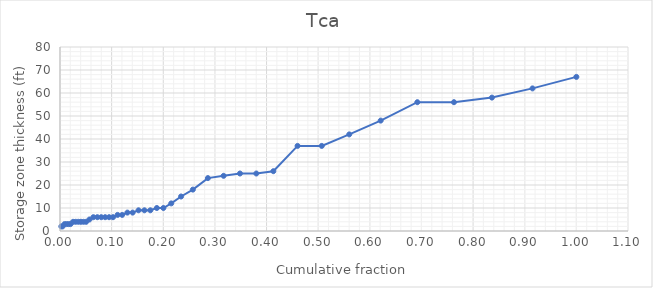
| Category | Series 0 |
|---|---|
| 0.0025348542458808617 | 2 |
| 0.005069708491761723 | 2 |
| 0.008871989860583017 | 3 |
| 0.012674271229404309 | 3 |
| 0.016476552598225603 | 3 |
| 0.020278833967046897 | 3 |
| 0.02534854245880862 | 4 |
| 0.030418250950570346 | 4 |
| 0.035487959442332066 | 4 |
| 0.04055766793409379 | 4 |
| 0.04562737642585551 | 4 |
| 0.05069708491761723 | 4 |
| 0.05703422053231938 | 5 |
| 0.06463878326996196 | 6 |
| 0.07224334600760454 | 6 |
| 0.07984790874524712 | 6 |
| 0.0874524714828897 | 6 |
| 0.09505703422053229 | 6 |
| 0.10266159695817487 | 6 |
| 0.11153358681875788 | 7 |
| 0.1204055766793409 | 7 |
| 0.13054499366286434 | 8 |
| 0.1406844106463878 | 8 |
| 0.15209125475285168 | 9 |
| 0.16349809885931554 | 9 |
| 0.1749049429657794 | 9 |
| 0.18757921419518372 | 10 |
| 0.20025348542458804 | 10 |
| 0.2154626108998732 | 12 |
| 0.23447401774397966 | 15 |
| 0.2572877059569074 | 18 |
| 0.2864385297845373 | 23 |
| 0.31685678073510765 | 24 |
| 0.34854245880861845 | 25 |
| 0.3802281368821292 | 25 |
| 0.4131812420785804 | 26 |
| 0.46007604562737636 | 37 |
| 0.5069708491761723 | 37 |
| 0.5602027883396704 | 42 |
| 0.6210392902408111 | 48 |
| 0.6920152091254752 | 56 |
| 0.7629911280101394 | 56 |
| 0.8365019011406843 | 58 |
| 0.915082382762991 | 62 |
| 0.9999999999999999 | 67 |